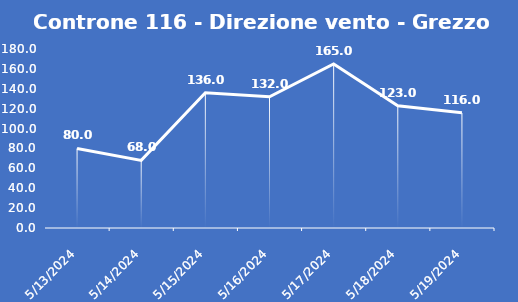
| Category | Controne 116 - Direzione vento - Grezzo (°N) |
|---|---|
| 5/13/24 | 80 |
| 5/14/24 | 68 |
| 5/15/24 | 136 |
| 5/16/24 | 132 |
| 5/17/24 | 165 |
| 5/18/24 | 123 |
| 5/19/24 | 116 |